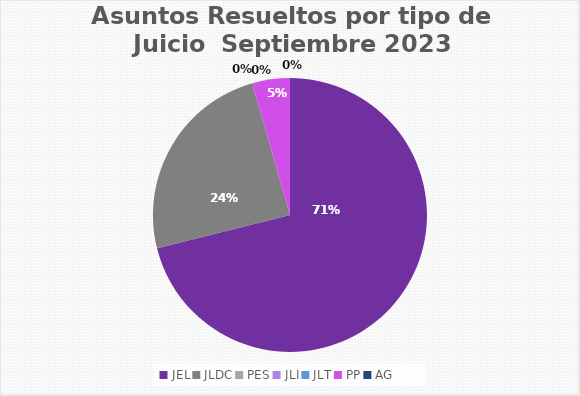
| Category | Asuntos Resueltos por tipo de Juicio  SEPTEIMBRE |
|---|---|
| JEL | 32 |
| JLDC | 11 |
| PES | 0 |
| JLI | 0 |
| JLT | 0 |
| PP | 2 |
| AG | 0 |